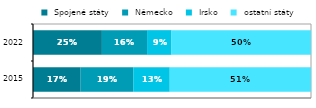
| Category |  Spojené státy |  Německo |  Irsko |  ostatní státy |
|---|---|---|---|---|
|  2015 | 0.171 | 0.189 | 0.131 | 0.508 |
| 2022 | 0.248 | 0.162 | 0.088 | 0.502 |